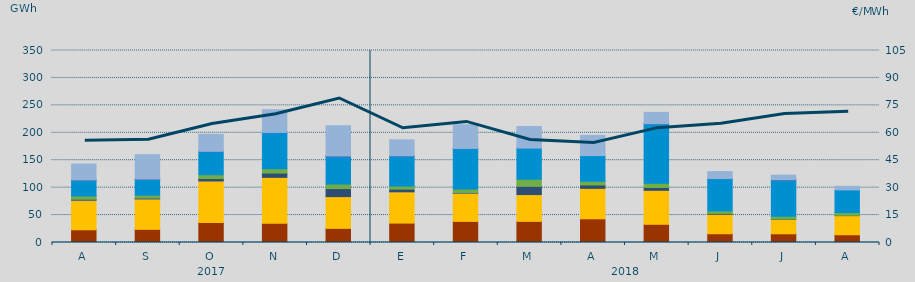
| Category | Carbón | Ciclo Combinado | Cogeneración | Consumo Bombeo | Eólica | Hidráulica | Nuclear | Otras Renovables | Turbinación bombeo |
|---|---|---|---|---|---|---|---|---|---|
| A | 23185.3 | 53888.3 | 1.1 | 1823.4 | 5883.3 | 29023.6 | 148 | 0 | 29140 |
| S | 23990.4 | 55429.2 | 0.8 | 1551.4 | 5247.3 | 29358.5 | 3.1 | 0 | 44532.5 |
| O | 36235.6 | 75955.4 | 2 | 4285.9 | 7050.1 | 42190.9 | 700 | 131.3 | 30549.8 |
| N | 35124.9 | 83653.4 | 0 | 7774.4 | 7943.5 | 66112.3 | 0 | 299.1 | 41077.1 |
| D | 25784.6 | 57877.3 | 0 | 14602.9 | 8236.4 | 50297.7 | 1085.4 | 57.5 | 54906.6 |
| E | 35353.2 | 57056.1 | 10.8 | 4781.6 | 5669.6 | 55012.6 | 282.3 | 69.8 | 28937.8 |
| F | 38501.6 | 51366.4 | 3 | 876.5 | 6719.4 | 74091.8 | 129.7 | 8.1 | 42931.7 |
| M | 38546.8 | 48796.7 | 0 | 14986.9 | 13034.1 | 57129.4 | 0 | 7.9 | 39005.1 |
| A | 43196.7 | 55522.2 | 0 | 6134.1 | 6758.4 | 46798.3 | 0 | 0 | 36861.2 |
| M | 33193.7 | 61920.1 | 0 | 5137.4 | 7808.1 | 108282.8 | 306.6 | 16.5 | 20554.6 |
| J | 15935.3 | 35519.8 | 0 | 1509.9 | 4554.3 | 58954.4 | 75 | 0 | 12771.1 |
| J | 15870.8 | 26056.8 | 0 | 559.4 | 5548.3 | 66078.1 | 193.3 | 0 | 8452.7 |
| A | 14111.4 | 34857 | 0 | 481.3 | 5182.6 | 41241.9 | 0 | 0 | 6495.2 |